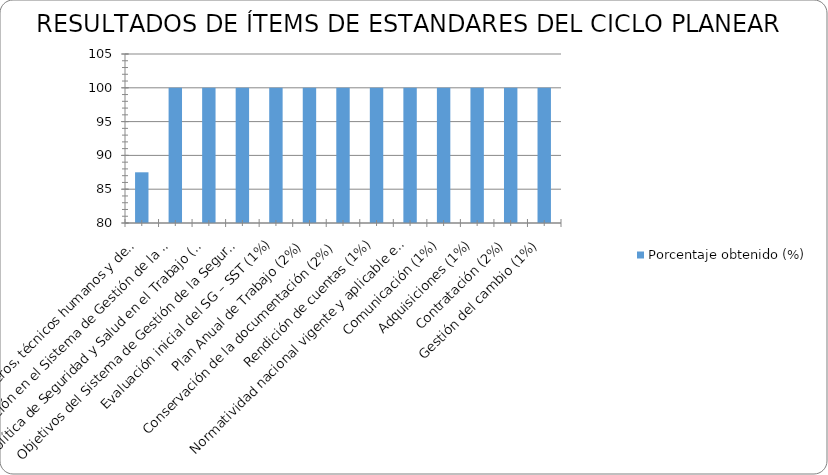
| Category | Porcentaje obtenido (%) |
|---|---|
| Recursos financieros, técnicos humanos y de otra índole requeridos para coordinar y desarrollar el Sistema de Gestión de la Seguridad y Salud en el Trabajo (SG-SST). (4%) | 87.5 |
| Capacitación en el Sistema de Gestión de la Seguridad y Salud en el Trabajo. (6%) | 100 |
| Política de Seguridad y Salud en el Trabajo (1%) | 100 |
| Objetivos del Sistema de Gestión de la Seguridad y Salud en el Trabajo SG-SST (1%) | 100 |
| Evaluación inicial del SG – SST (1%) | 100 |
| Plan Anual de Trabajo (2%) | 100 |
| Conservación de la documentación (2%) | 100 |
| Rendición de cuentas (1%) | 100 |
| Normatividad nacional vigente y aplicable en materia de seguridad y salud en el trabajo. (2%) | 100 |
| Comunicación (1%) | 100 |
| Adquisiciones (1%) | 100 |
| Contratación (2%) | 100 |
| Gestión del cambio (1%) | 100 |